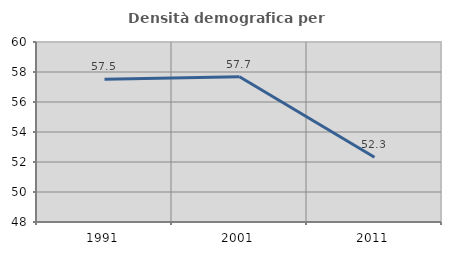
| Category | Densità demografica |
|---|---|
| 1991.0 | 57.52 |
| 2001.0 | 57.68 |
| 2011.0 | 52.32 |